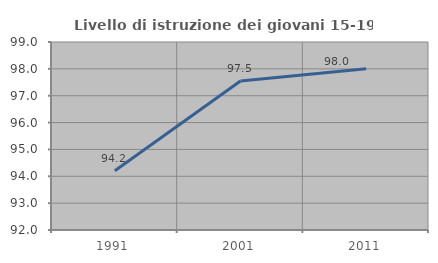
| Category | Livello di istruzione dei giovani 15-19 anni |
|---|---|
| 1991.0 | 94.203 |
| 2001.0 | 97.549 |
| 2011.0 | 98 |